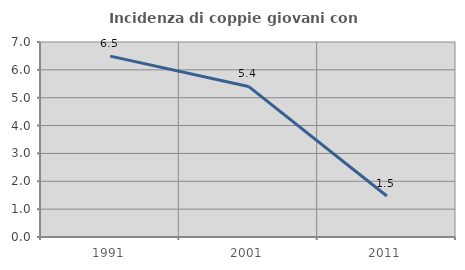
| Category | Incidenza di coppie giovani con figli |
|---|---|
| 1991.0 | 6.494 |
| 2001.0 | 5.405 |
| 2011.0 | 1.471 |